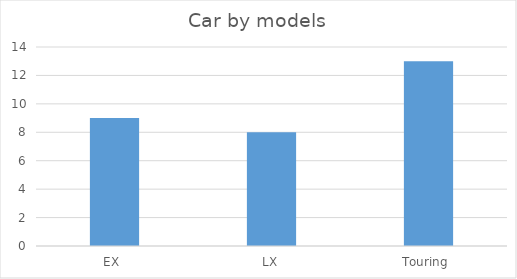
| Category | Series 0 |
|---|---|
| EX  | 9 |
| LX | 8 |
| Touring  | 13 |